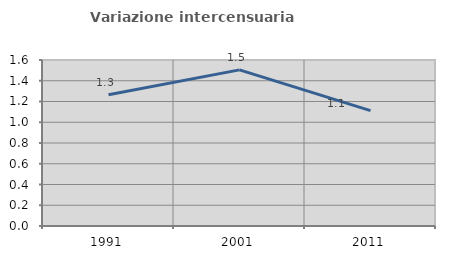
| Category | Variazione intercensuaria annua |
|---|---|
| 1991.0 | 1.264 |
| 2001.0 | 1.505 |
| 2011.0 | 1.113 |